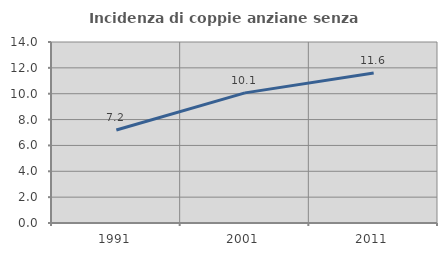
| Category | Incidenza di coppie anziane senza figli  |
|---|---|
| 1991.0 | 7.191 |
| 2001.0 | 10.066 |
| 2011.0 | 11.594 |